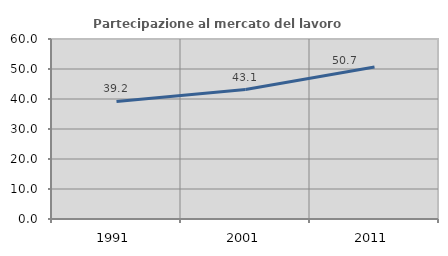
| Category | Partecipazione al mercato del lavoro  femminile |
|---|---|
| 1991.0 | 39.189 |
| 2001.0 | 43.148 |
| 2011.0 | 50.654 |